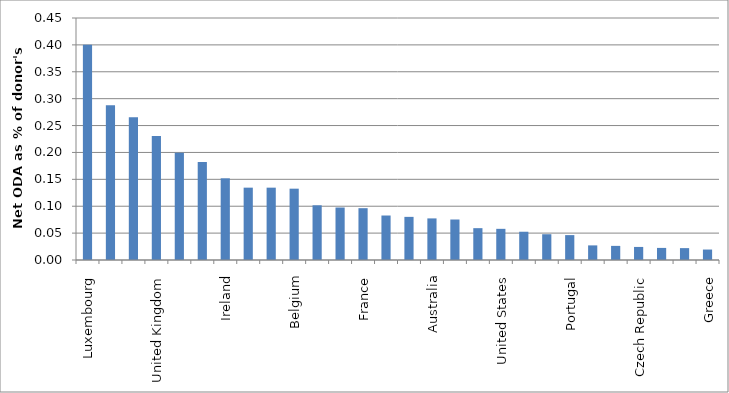
| Category | Net ODA to LDCs as % of GNI |
|---|---|
| Luxembourg | 0.4 |
| Sweden | 0.288 |
| Norway | 0.266 |
| United Kingdom | 0.231 |
| Denmark | 0.2 |
| Finland | 0.182 |
| Ireland | 0.152 |
| Switzerland | 0.135 |
| Netherlands | 0.135 |
| Belgium | 0.133 |
| Canada | 0.102 |
| Iceland | 0.098 |
| France | 0.096 |
| New Zealand | 0.083 |
| Japan | 0.08 |
| Australia | 0.077 |
| Germany | 0.075 |
| Austria | 0.059 |
| United States | 0.058 |
| Korea | 0.053 |
| Italy | 0.048 |
| Portugal | 0.046 |
| Poland | 0.027 |
| Spain | 0.026 |
| Czech Republic | 0.024 |
| Slovenia | 0.022 |
| Slovak Republic | 0.022 |
| Greece | 0.019 |